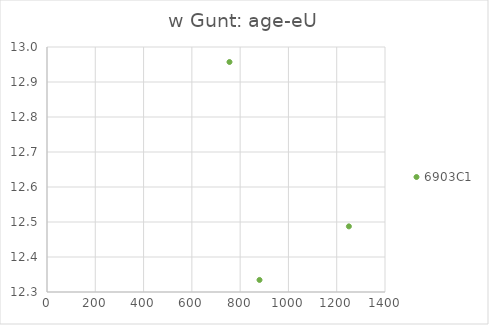
| Category | 6903C1 |
|---|---|
| 880.2266451599178 | 12.334 |
| 1250.4229013559707 | 12.488 |
| 755.8638512762852 | 12.957 |